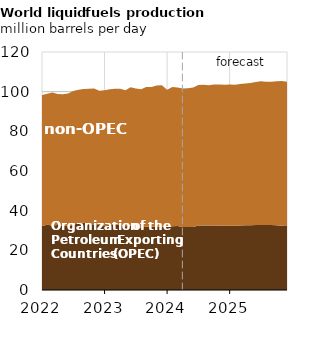
| Category | OPEC Countries | non-OPEC Countries |
|---|---|---|
| 2022-01-01 | 32.234 | 66.031 |
| 2022-02-01 | 32.842 | 66.151 |
| 2022-03-01 | 32.486 | 67.152 |
| 2022-04-01 | 32.73 | 66.048 |
| 2022-05-01 | 32.281 | 66.421 |
| 2022-06-01 | 32.456 | 66.662 |
| 2022-07-01 | 32.768 | 67.573 |
| 2022-08-01 | 33.759 | 67.208 |
| 2022-09-01 | 33.874 | 67.488 |
| 2022-10-01 | 33.446 | 68.059 |
| 2022-11-01 | 33.085 | 68.496 |
| 2022-12-01 | 33.212 | 67.303 |
| 2023-01-01 | 32.58 | 68.087 |
| 2023-02-01 | 32.778 | 68.401 |
| 2023-03-01 | 32.967 | 68.51 |
| 2023-04-01 | 32.861 | 68.629 |
| 2023-05-01 | 32.148 | 68.629 |
| 2023-06-01 | 32.371 | 69.821 |
| 2023-07-01 | 31.548 | 69.998 |
| 2023-08-01 | 31.364 | 69.883 |
| 2023-09-01 | 31.988 | 70.306 |
| 2023-10-01 | 31.854 | 70.537 |
| 2023-11-01 | 31.905 | 71.247 |
| 2023-12-01 | 31.892 | 71.281 |
| 2024-01-01 | 31.804 | 69.209 |
| 2024-02-01 | 32.102 | 70.28 |
| 2024-03-01 | 32.254 | 69.842 |
| 2024-04-01 | 31.758 | 69.786 |
| 2024-05-01 | 31.758 | 69.985 |
| 2024-06-01 | 31.78 | 70.295 |
| 2024-07-01 | 32.527 | 70.834 |
| 2024-08-01 | 32.576 | 70.943 |
| 2024-09-01 | 32.58 | 70.689 |
| 2024-10-01 | 32.519 | 71.052 |
| 2024-11-01 | 32.392 | 71.275 |
| 2024-12-01 | 32.477 | 71.047 |
| 2025-01-01 | 32.45 | 71.138 |
| 2025-02-01 | 32.449 | 71.087 |
| 2025-03-01 | 32.547 | 71.272 |
| 2025-04-01 | 32.589 | 71.551 |
| 2025-05-01 | 32.637 | 71.679 |
| 2025-06-01 | 32.736 | 72.156 |
| 2025-07-01 | 32.729 | 72.546 |
| 2025-08-01 | 32.727 | 72.293 |
| 2025-09-01 | 32.726 | 72.336 |
| 2025-10-01 | 32.618 | 72.659 |
| 2025-11-01 | 32.417 | 72.921 |
| 2025-12-01 | 32.317 | 72.711 |